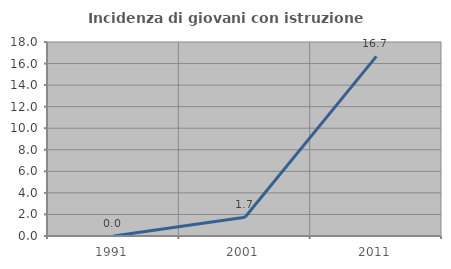
| Category | Incidenza di giovani con istruzione universitaria |
|---|---|
| 1991.0 | 0 |
| 2001.0 | 1.739 |
| 2011.0 | 16.667 |